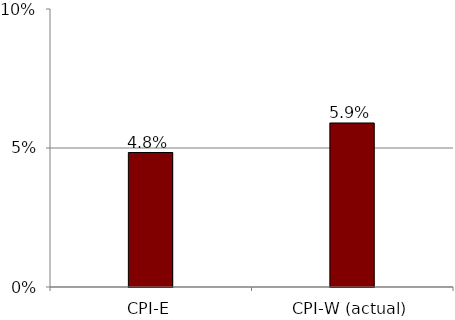
| Category | COLA |
|---|---|
| CPI-E | 0.048 |
| CPI-W (actual) | 0.059 |